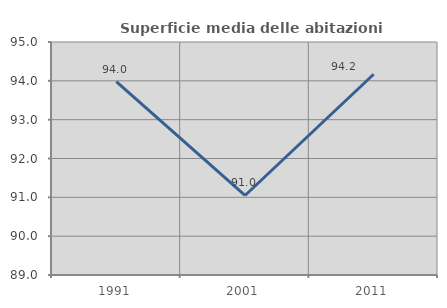
| Category | Superficie media delle abitazioni occupate |
|---|---|
| 1991.0 | 93.981 |
| 2001.0 | 91.047 |
| 2011.0 | 94.169 |